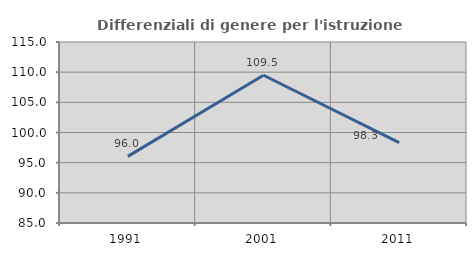
| Category | Differenziali di genere per l'istruzione superiore |
|---|---|
| 1991.0 | 96.046 |
| 2001.0 | 109.49 |
| 2011.0 | 98.328 |